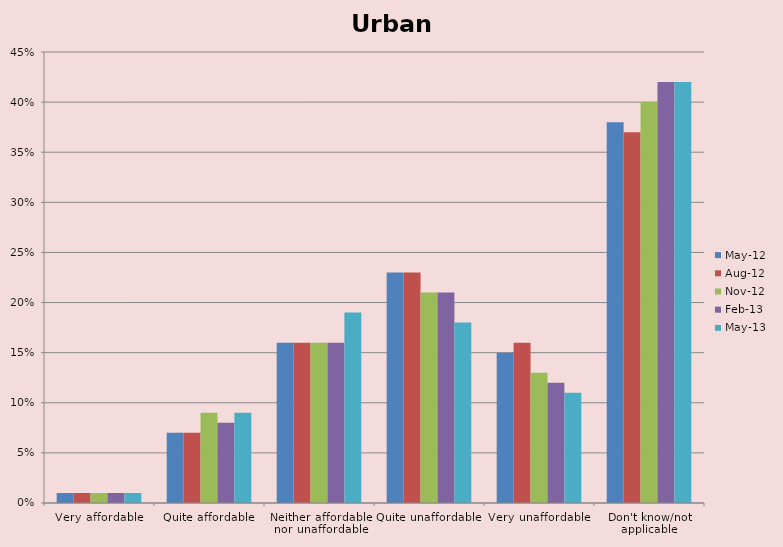
| Category | May-12 | Aug-12 | Nov-12 | Feb-13 | May-13 |
|---|---|---|---|---|---|
| Very affordable | 0.01 | 0.01 | 0.01 | 0.01 | 0.01 |
| Quite affordable | 0.07 | 0.07 | 0.09 | 0.08 | 0.09 |
| Neither affordable nor unaffordable | 0.16 | 0.16 | 0.16 | 0.16 | 0.19 |
| Quite unaffordable | 0.23 | 0.23 | 0.21 | 0.21 | 0.18 |
| Very unaffordable | 0.15 | 0.16 | 0.13 | 0.12 | 0.11 |
| Don't know/not applicable | 0.38 | 0.37 | 0.4 | 0.42 | 0.42 |